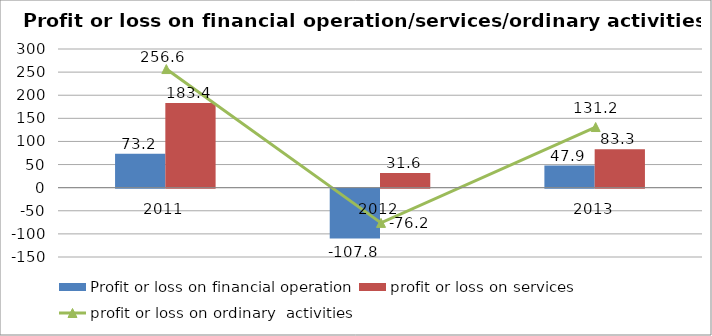
| Category | Profit or loss on financial operation | profit or loss on services |
|---|---|---|
| 2011.0 | 73.2 | 183.4 |
| 2012.0 | -107.8 | 31.6 |
| 2013.0 | 47.9 | 83.3 |